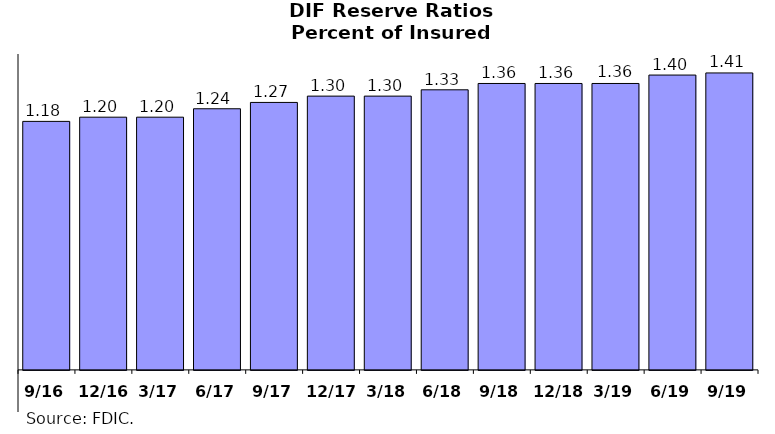
| Category | Series 0 |
|---|---|
| 9/16 | 1.18 |
| 12/16 | 1.2 |
| 3/17 | 1.2 |
| 6/17 | 1.24 |
| 9/17 | 1.27 |
| 12/17 | 1.3 |
| 3/18 | 1.3 |
| 6/18 | 1.33 |
| 9/18 | 1.36 |
| 12/18 | 1.36 |
| 3/19 | 1.36 |
| 6/19 | 1.4 |
| 9/19 | 1.41 |